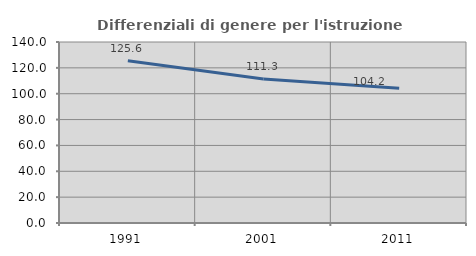
| Category | Differenziali di genere per l'istruzione superiore |
|---|---|
| 1991.0 | 125.571 |
| 2001.0 | 111.303 |
| 2011.0 | 104.185 |